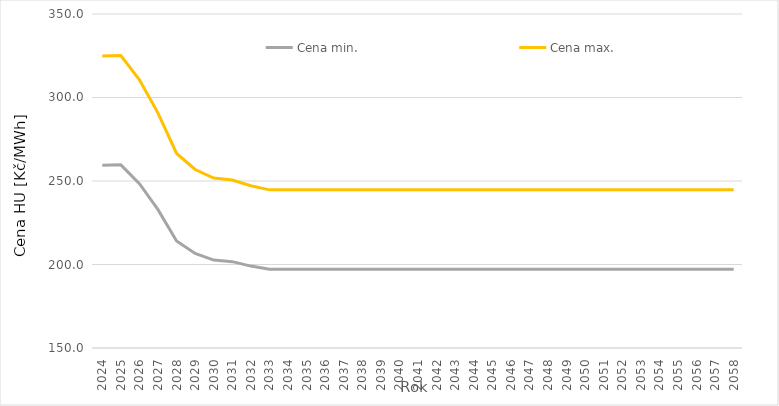
| Category | Cena min. | Cena max. |
|---|---|---|
| 2024.0 | 259.433 | 324.814 |
| 2025.0 | 259.678 | 325.129 |
| 2026.0 | 248.367 | 310.586 |
| 2027.0 | 232.867 | 290.657 |
| 2028.0 | 214.074 | 266.495 |
| 2029.0 | 206.601 | 256.888 |
| 2030.0 | 202.637 | 251.791 |
| 2031.0 | 201.7 | 250.586 |
| 2032.0 | 199.045 | 247.172 |
| 2033.0 | 197.113 | 244.688 |
| 2034.0 | 197.113 | 244.688 |
| 2035.0 | 197.113 | 244.688 |
| 2036.0 | 197.113 | 244.688 |
| 2037.0 | 197.113 | 244.688 |
| 2038.0 | 197.113 | 244.688 |
| 2039.0 | 197.113 | 244.688 |
| 2040.0 | 197.113 | 244.688 |
| 2041.0 | 197.113 | 244.688 |
| 2042.0 | 197.113 | 244.688 |
| 2043.0 | 197.113 | 244.688 |
| 2044.0 | 197.113 | 244.688 |
| 2045.0 | 197.113 | 244.688 |
| 2046.0 | 197.113 | 244.688 |
| 2047.0 | 197.113 | 244.688 |
| 2048.0 | 197.113 | 244.688 |
| 2049.0 | 197.113 | 244.688 |
| 2050.0 | 197.113 | 244.688 |
| 2051.0 | 197.113 | 244.688 |
| 2052.0 | 197.113 | 244.688 |
| 2053.0 | 197.113 | 244.688 |
| 2054.0 | 197.113 | 244.688 |
| 2055.0 | 197.113 | 244.688 |
| 2056.0 | 197.113 | 244.688 |
| 2057.0 | 197.113 | 244.688 |
| 2058.0 | 197.113 | 244.688 |